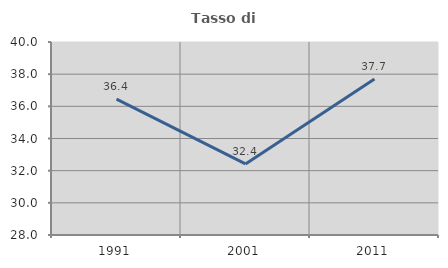
| Category | Tasso di occupazione   |
|---|---|
| 1991.0 | 36.446 |
| 2001.0 | 32.418 |
| 2011.0 | 37.706 |